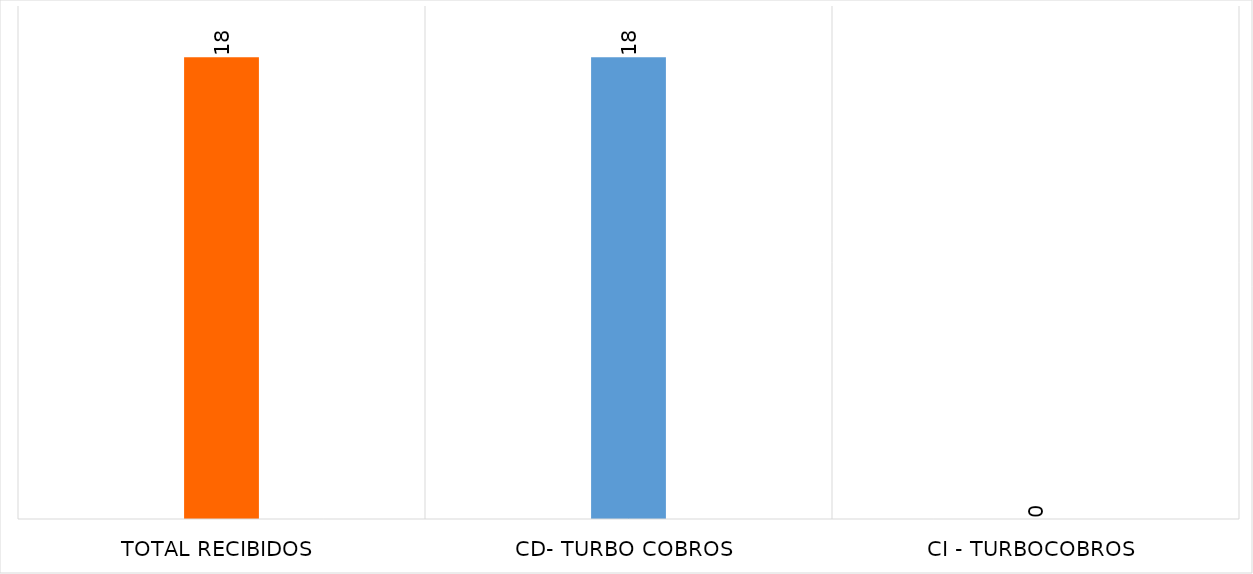
| Category | Series 0 |
|---|---|
| TOTAL RECIBIDOS | 18 |
| CD- TURBO COBROS | 18 |
| CI - TURBOCOBROS | 0 |